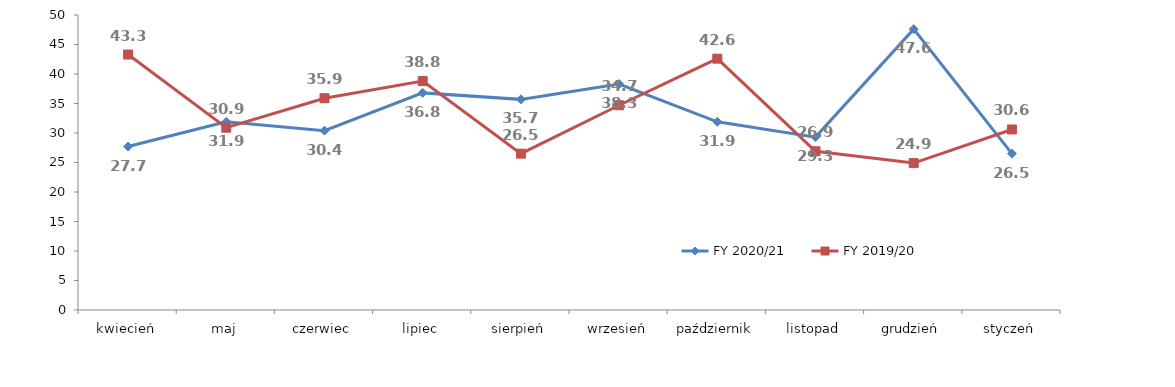
| Category | FY 2020/21 | FY 2019/20 |
|---|---|---|
| kwiecień | 27.7 | 43.3 |
| maj | 31.9 | 30.9 |
| czerwiec | 30.4 | 35.9 |
| lipiec | 36.8 | 38.8 |
| sierpień | 35.7 | 26.5 |
| wrzesień | 38.3 | 34.7 |
| październik | 31.9 | 42.6 |
| listopad | 29.3 | 26.9 |
| grudzień | 47.6 | 24.9 |
| styczeń | 26.5 | 30.6 |